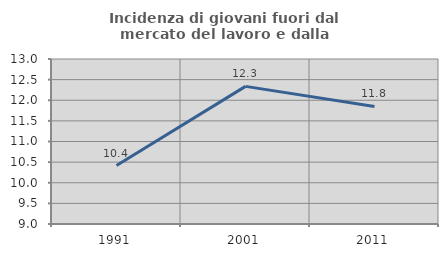
| Category | Incidenza di giovani fuori dal mercato del lavoro e dalla formazione  |
|---|---|
| 1991.0 | 10.418 |
| 2001.0 | 12.336 |
| 2011.0 | 11.85 |